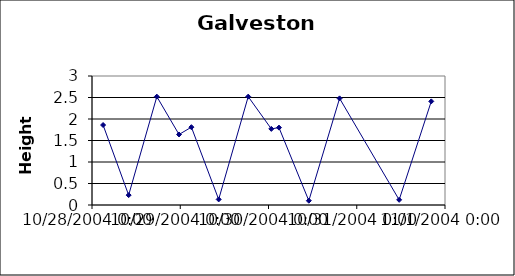
| Category | Series 0 |
|---|---|
| 38288.12569444445 | 1.86 |
| 38288.41527777778 | 0.23 |
| 38288.73472222222 | 2.52 |
| 38288.98611111111 | 1.64 |
| 38289.126388888886 | 1.81 |
| 38289.43541666667 | 0.13 |
| 38289.77013888889 | 2.52 |
| 38290.03194444445 | 1.77 |
| 38290.11875 | 1.8 |
| 38290.45694444444 | 0.1 |
| 38290.805555555555 | 2.48 |
| 38291.48055555556 | 0.12 |
| 38291.84444444445 | 2.41 |